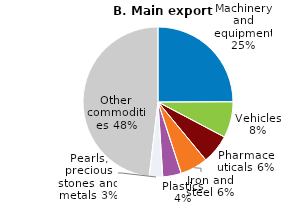
| Category | Series 0 |
|---|---|
| Machinery and equipment | 24.947 |
| Vehicles | 7.777 |
| Pharmaceuticals | 6.302 |
| Iron and steel | 5.967 |
| Plastics | 3.995 |
| Pearls, precious stones and metals | 2.899 |
| Other commodities | 48.113 |